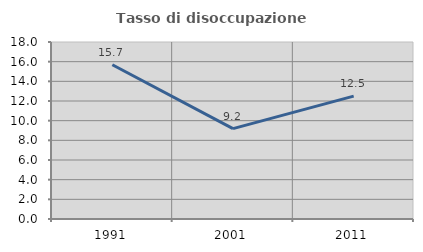
| Category | Tasso di disoccupazione giovanile  |
|---|---|
| 1991.0 | 15.686 |
| 2001.0 | 9.195 |
| 2011.0 | 12.5 |